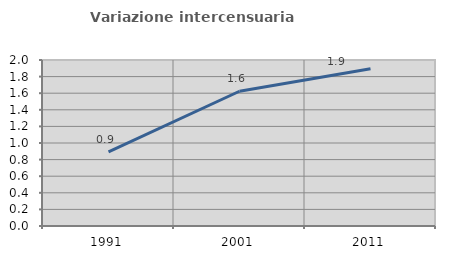
| Category | Variazione intercensuaria annua |
|---|---|
| 1991.0 | 0.894 |
| 2001.0 | 1.624 |
| 2011.0 | 1.894 |